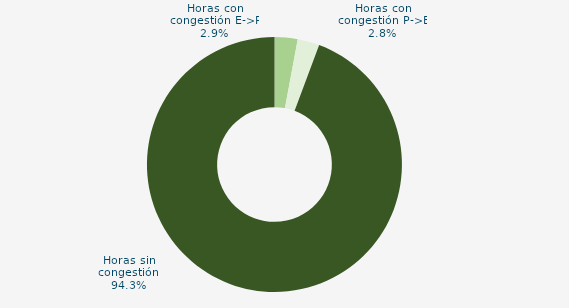
| Category | Horas con congestión E->P |
|---|---|
| Horas con congestión E->P | 2.917 |
| Horas con congestión P->E | 2.778 |
| Horas sin congestión | 94.306 |